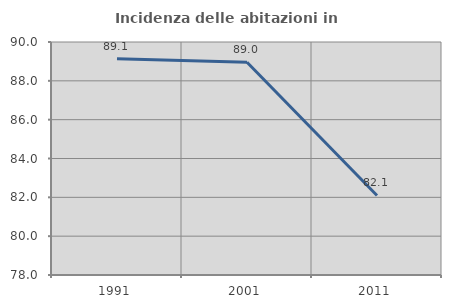
| Category | Incidenza delle abitazioni in proprietà  |
|---|---|
| 1991.0 | 89.138 |
| 2001.0 | 88.955 |
| 2011.0 | 82.095 |